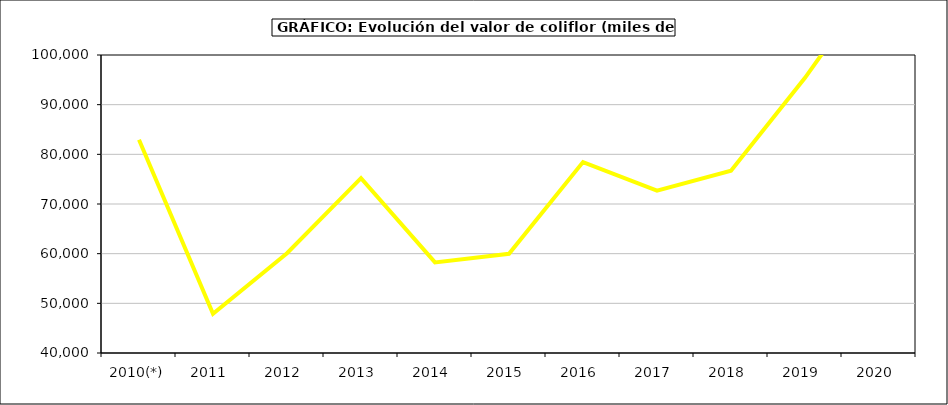
| Category | Valor |
|---|---|
| 2010(*) | 82925.588 |
| 2011  | 47916.69 |
| 2012  | 60097.372 |
| 2013  | 75196.05 |
| 2014  | 58249.149 |
| 2015  | 59963 |
| 2016  | 78452 |
| 2017  | 72692.622 |
| 2018  | 76706.611 |
| 2019  | 95406.878 |
| 2020  | 116287.449 |